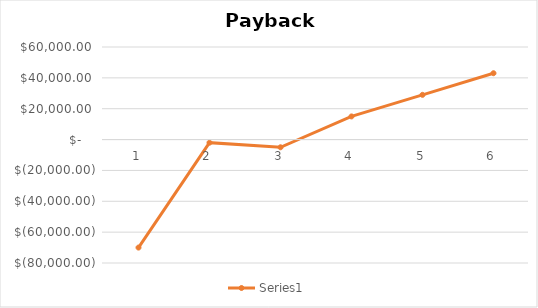
| Category | Series 1 |
|---|---|
| 0 | -70000 |
| 1 | -2000 |
| 2 | -5000 |
| 3 | 15000 |
| 4 | 29000 |
| 5 | 43000 |